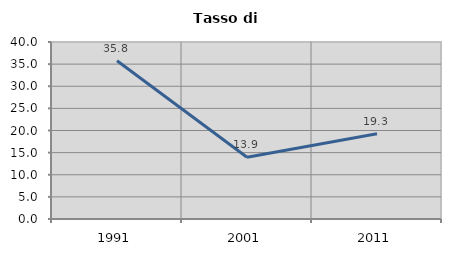
| Category | Tasso di disoccupazione   |
|---|---|
| 1991.0 | 35.765 |
| 2001.0 | 13.946 |
| 2011.0 | 19.253 |